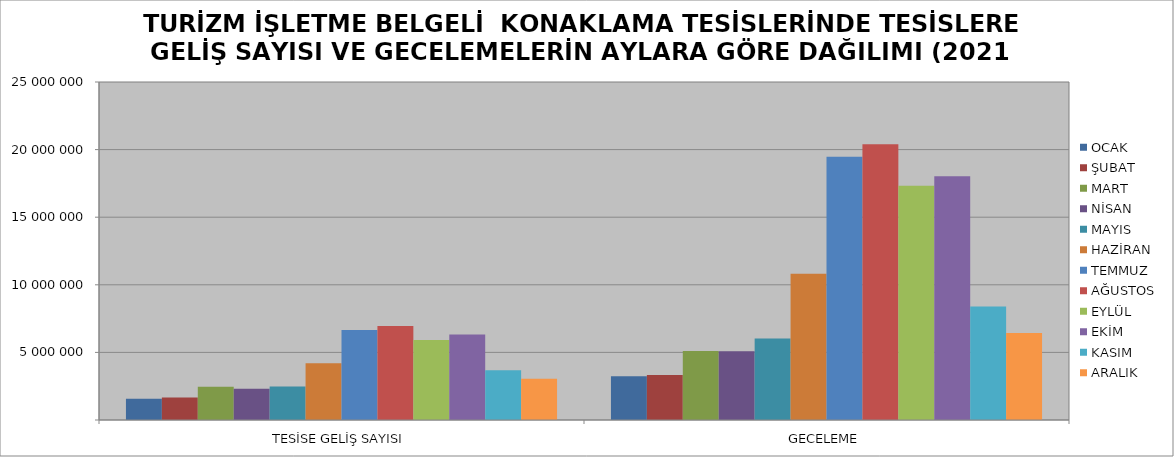
| Category | OCAK | ŞUBAT | MART | NİSAN | MAYIS | HAZİRAN | TEMMUZ | AĞUSTOS | EYLÜL | EKİM | KASIM | ARALIK |
|---|---|---|---|---|---|---|---|---|---|---|---|---|
| TESİSE GELİŞ SAYISI | 1571594 | 1670164 | 2462715 | 2305703 | 2480312 | 4203299 | 6647723 | 6953153 | 5925169 | 6333100 | 3670952 | 3057255 |
| GECELEME | 3239980 | 3333484 | 5094921 | 5081446 | 6019981 | 10819754 | 19475865 | 20388962 | 17330893 | 18033301 | 8403355 | 6432769 |